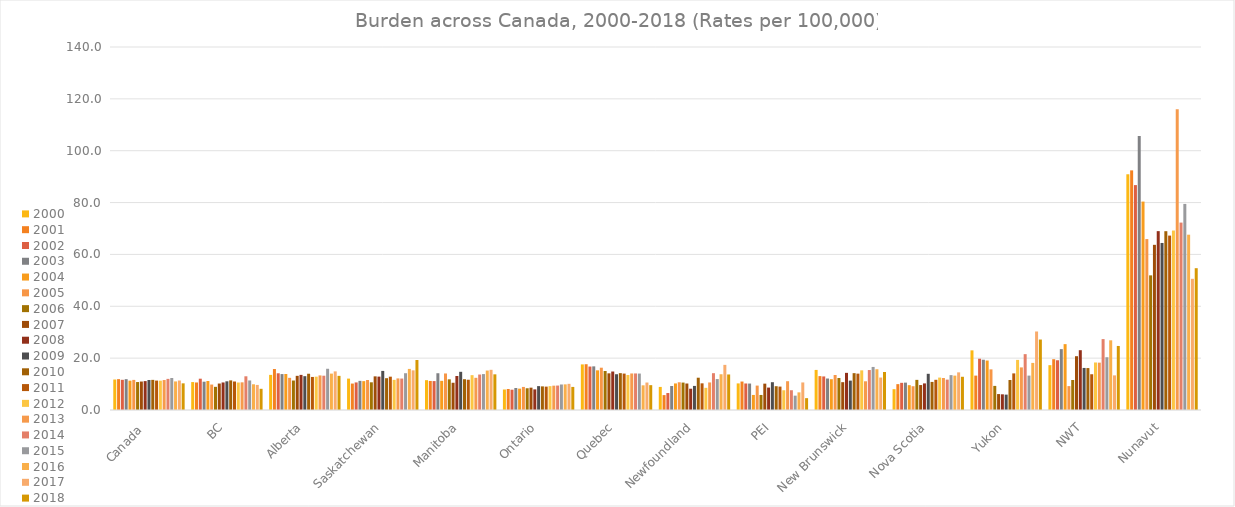
| Category | 2000 | 2001 | 2002 | 2003 | 2004 | 2005 | 2006 | 2007 | 2008 | 2009 | 2010 | 2011 | 2012 | 2013 | 2014 | 2015 | 2016 | 2017 | 2018 |
|---|---|---|---|---|---|---|---|---|---|---|---|---|---|---|---|---|---|---|---|
| Canada  | 11.751 | 11.902 | 11.639 | 11.898 | 11.312 | 11.608 | 10.783 | 10.979 | 11.144 | 11.567 | 11.619 | 11.346 | 11.309 | 11.555 | 12.004 | 12.338 | 11.016 | 11.376 | 10.284 |
| BC | 10.769 | 10.621 | 12.072 | 10.91 | 11.19 | 9.819 | 8.935 | 10.207 | 10.622 | 11.064 | 11.421 | 10.995 | 10.598 | 10.669 | 13.002 | 11.389 | 9.919 | 9.671 | 8.174 |
| Alberta | 13.548 | 15.794 | 14.16 | 13.855 | 13.895 | 12.403 | 11.37 | 13.175 | 13.543 | 13.047 | 13.987 | 12.747 | 12.853 | 13.338 | 13.223 | 15.901 | 14.037 | 14.892 | 13.164 |
| Saskatchewan | 12.108 | 10.198 | 10.634 | 11.241 | 11.13 | 11.575 | 10.682 | 12.973 | 12.876 | 15.075 | 12.269 | 12.851 | 11.626 | 12.185 | 12.13 | 14.184 | 15.845 | 15.294 | 19.276 |
| Manitoba | 11.505 | 11.203 | 11.153 | 14.18 | 11.251 | 14.089 | 11.829 | 10.509 | 13.108 | 14.728 | 11.878 | 11.673 | 13.44 | 12.415 | 13.682 | 13.852 | 15.219 | 15.501 | 13.756 |
| Ontario | 7.9 | 8.103 | 7.83 | 8.477 | 8.24 | 8.9 | 8.387 | 8.617 | 7.956 | 9.209 | 9.113 | 9.019 | 9.2 | 9.385 | 9.429 | 9.842 | 9.888 | 10.091 | 8.902 |
| Quebec | 17.589 | 17.657 | 16.757 | 16.832 | 15.301 | 16.316 | 15.042 | 14.143 | 14.842 | 13.795 | 14.213 | 14.041 | 13.509 | 14.092 | 14.098 | 14.055 | 9.519 | 10.593 | 9.582 |
| Newfoundland | 8.902 | 5.747 | 6.545 | 9.258 | 10.243 | 10.693 | 10.576 | 10.215 | 8.21 | 9.289 | 12.452 | 10.286 | 8.55 | 10.624 | 14.2 | 11.929 | 13.789 | 17.406 | 13.705 |
| PEI | 10.259 | 10.976 | 10.228 | 10.202 | 5.811 | 9.416 | 5.803 | 10.166 | 8.649 | 10.723 | 9.177 | 9.03 | 7.611 | 11.104 | 7.624 | 5.535 | 6.804 | 10.627 | 4.568 |
| New Brunswick | 15.456 | 13.07 | 12.944 | 12.142 | 11.876 | 13.502 | 12.339 | 10.732 | 14.326 | 11.334 | 14.209 | 14.027 | 15.296 | 11.074 | 15.416 | 16.604 | 15.72 | 12.519 | 14.663 |
| Nova Scotia | 8.032 | 9.973 | 10.479 | 10.558 | 9.578 | 9.169 | 11.622 | 9.624 | 10.258 | 13.963 | 10.827 | 11.649 | 12.505 | 12.335 | 11.72 | 13.454 | 13.259 | 14.516 | 12.813 |
| Yukon | 23.003 | 13.263 | 19.778 | 19.392 | 19.075 | 15.673 | 9.296 | 6.144 | 6.045 | 5.929 | 11.562 | 14.12 | 19.319 | 16.429 | 21.542 | 13.266 | 18.16 | 30.282 | 27.177 |
| NWT | 17.292 | 19.586 | 19.185 | 23.474 | 25.401 | 9.217 | 11.58 | 20.751 | 23.063 | 16.22 | 16.172 | 13.792 | 18.328 | 18.263 | 27.345 | 20.345 | 26.876 | 13.352 | 24.696 |
| Nunavut | 90.916 | 92.418 | 86.739 | 105.723 | 80.383 | 65.922 | 51.926 | 63.704 | 68.983 | 64.423 | 68.961 | 67.267 | 69.22 | 116.026 | 72.28 | 79.478 | 67.613 | 50.597 | 54.693 |